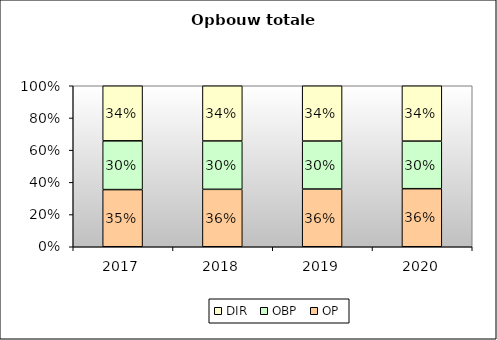
| Category | OP | OBP | DIR |
|---|---|---|---|
| 2017.0 | 0.355 | 0.303 | 0.342 |
| 2018.0 | 0.357 | 0.3 | 0.343 |
| 2019.0 | 0.359 | 0.298 | 0.343 |
| 2020.0 | 0.361 | 0.295 | 0.344 |